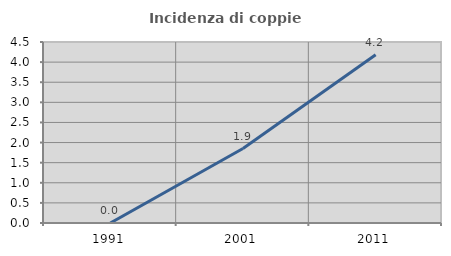
| Category | Incidenza di coppie miste |
|---|---|
| 1991.0 | 0 |
| 2001.0 | 1.852 |
| 2011.0 | 4.183 |